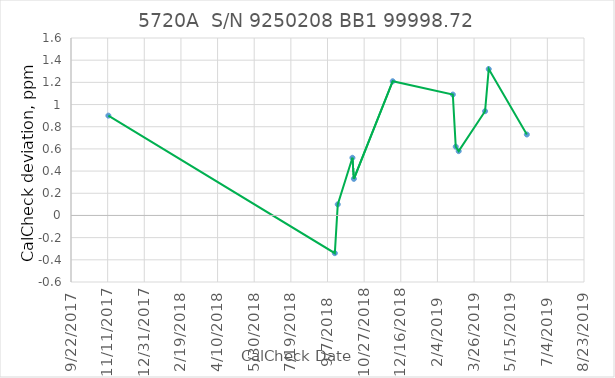
| Category | Series 0 |
|---|---|
| 43051.0 | 0.9 |
| 43360.0 | -0.34 |
| 43364.0 | 0.1 |
| 43384.0 | 0.52 |
| 43386.0 | 0.33 |
| 43439.0 | 1.21 |
| 43521.0 | 1.09 |
| 43525.0 | 0.62 |
| 43529.0 | 0.58 |
| 43565.0 | 0.94 |
| 43570.0 | 1.32 |
| 43622.0 | 0.73 |